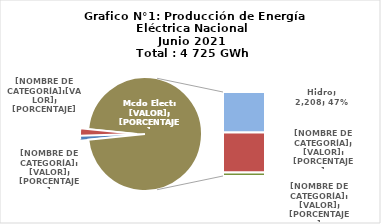
| Category | Series 0 |
|---|---|
| 0 | 51.684 |
| 1 | 97.517 |
| 2 | 2207.962 |
| 3 | 2179.048 |
| 4 | 188.452 |